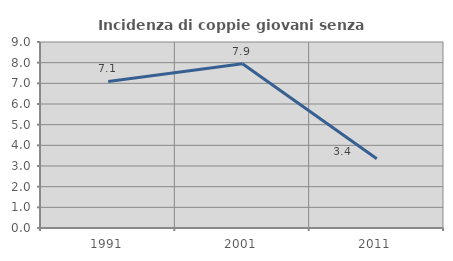
| Category | Incidenza di coppie giovani senza figli |
|---|---|
| 1991.0 | 7.093 |
| 2001.0 | 7.946 |
| 2011.0 | 3.351 |